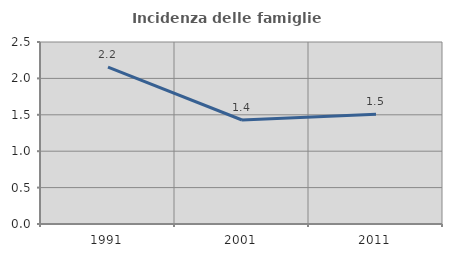
| Category | Incidenza delle famiglie numerose |
|---|---|
| 1991.0 | 2.154 |
| 2001.0 | 1.429 |
| 2011.0 | 1.506 |